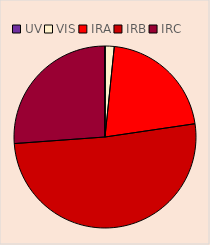
| Category | Series 0 |
|---|---|
| UV | 0.267 |
| VIS | 295.395 |
| IRA | 3807.519 |
| IRB | 9263.203 |
| IRC | 4733.667 |